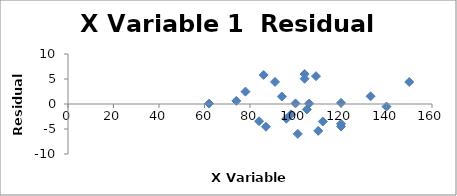
| Category | Series 0 |
|---|---|
| 86.0 | 5.812 |
| 62.0 | 0.086 |
| 110.0 | -5.375 |
| 101.0 | -5.978 |
| 100.0 | 0.117 |
| 78.0 | 2.475 |
| 120.0 | 0.229 |
| 105.0 | -1.079 |
| 112.0 | -3.504 |
| 120.0 | -3.956 |
| 87.0 | -4.543 |
| 133.0 | 1.536 |
| 140.0 | -0.504 |
| 84.0 | -3.451 |
| 106.0 | 0.094 |
| 109.0 | 5.565 |
| 104.0 | 5.996 |
| 150.0 | 4.402 |
| 98.0 | -2.067 |
| 120.0 | -4.499 |
| 74.0 | 0.624 |
| 96.0 | -2.939 |
| 104.0 | 5.057 |
| 94.0 | 1.488 |
| 91.0 | 4.414 |